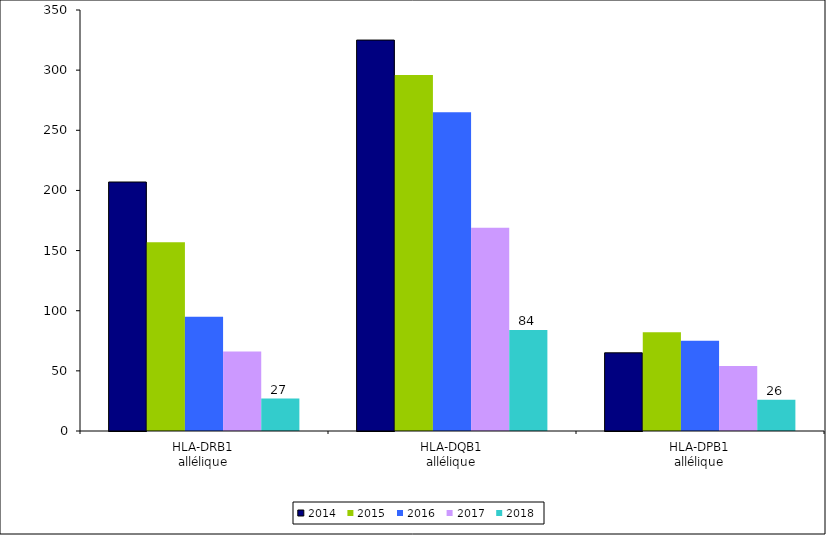
| Category | 2014 | 2015 | 2016 | 2017 | 2018 |
|---|---|---|---|---|---|
| HLA-DRB1
allélique | 207 | 157 | 95 | 66 | 27 |
| HLA-DQB1
allélique | 325 | 296 | 265 | 169 | 84 |
| HLA-DPB1
allélique | 65 | 82 | 75 | 54 | 26 |